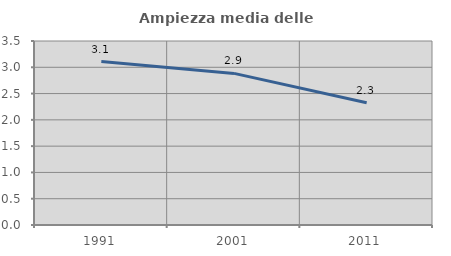
| Category | Ampiezza media delle famiglie |
|---|---|
| 1991.0 | 3.109 |
| 2001.0 | 2.884 |
| 2011.0 | 2.327 |